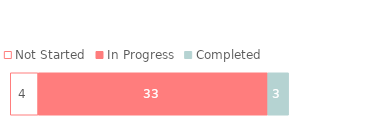
| Category | Not Started | In Progress | Completed |
|---|---|---|---|
| 0 | 4 | 33 | 3 |